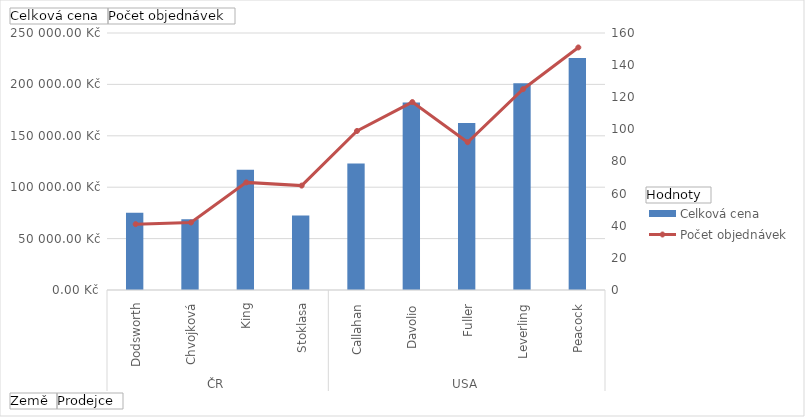
| Category | Celková cena |
|---|---|
| 0 | 75048.04 |
| 1 | 68822.25 |
| 2 | 116962.99 |
| 3 | 72527.63 |
| 4 | 123032.67 |
| 5 | 182500.09 |
| 6 | 162503.78 |
| 7 | 201196.27 |
| 8 | 225763.68 |